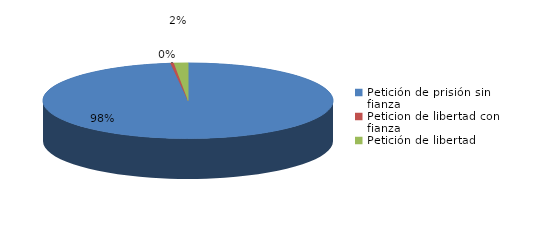
| Category | Series 0 |
|---|---|
| Petición de prisión sin fianza | 252 |
| Peticion de libertad con fianza | 1 |
| Petición de libertad | 4 |